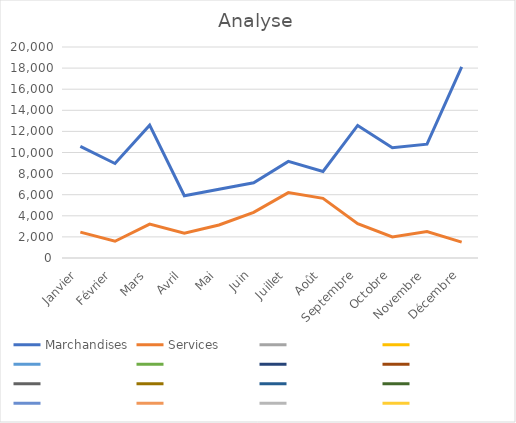
| Category | Marchandises | Services | Series 2 | Series 3 | Series 4 | Series 5 | Series 6 | Series 7 | Series 8 | Series 9 | Series 10 | Series 11 | Series 12 | Series 13 | Series 14 | Series 15 |
|---|---|---|---|---|---|---|---|---|---|---|---|---|---|---|---|---|
| Janvier | 10580 | 2450 |  |  |  |  |  |  |  |  |  |  |  |  |  |  |
| Février | 8956 | 1589 |  |  |  |  |  |  |  |  |  |  |  |  |  |  |
| Mars | 12587 | 3210 |  |  |  |  |  |  |  |  |  |  |  |  |  |  |
| Avril | 5899 | 2357 |  |  |  |  |  |  |  |  |  |  |  |  |  |  |
| Mai | 6524 | 3125 |  |  |  |  |  |  |  |  |  |  |  |  |  |  |
| Juin | 7125 | 4325 |  |  |  |  |  |  |  |  |  |  |  |  |  |  |
| Juillet | 9156 | 6198 |  |  |  |  |  |  |  |  |  |  |  |  |  |  |
| Août | 8198 | 5654 |  |  |  |  |  |  |  |  |  |  |  |  |  |  |
| Septembre | 12563 | 3259 |  |  |  |  |  |  |  |  |  |  |  |  |  |  |
| Octobre | 10452 | 2000 |  |  |  |  |  |  |  |  |  |  |  |  |  |  |
| Novembre | 10785 | 2500 |  |  |  |  |  |  |  |  |  |  |  |  |  |  |
| Décembre | 18123 | 1500 |  |  |  |  |  |  |  |  |  |  |  |  |  |  |